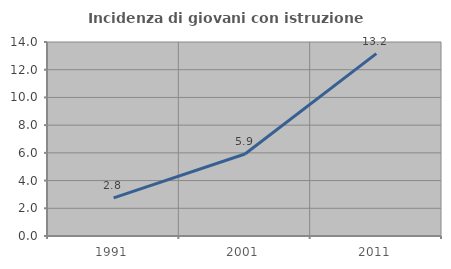
| Category | Incidenza di giovani con istruzione universitaria |
|---|---|
| 1991.0 | 2.752 |
| 2001.0 | 5.919 |
| 2011.0 | 13.165 |